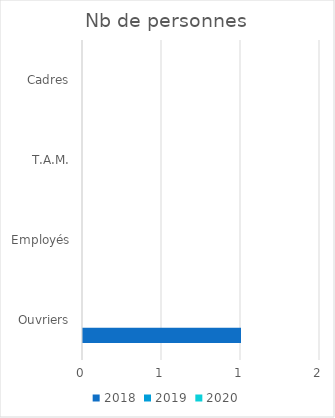
| Category | 2018 | 2019 | 2020 |
|---|---|---|---|
| Ouvriers | 1 | 0 | 0 |
| Employés | 0 | 0 | 0 |
| T.A.M. | 0 | 0 | 0 |
| Cadres | 0 | 0 | 0 |